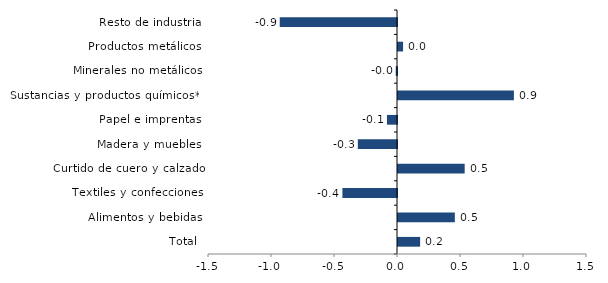
| Category | Series 0 |
|---|---|
| Total | 0.176 |
| Alimentos y bebidas | 0.451 |
| Textiles y confecciones | -0.433 |
| Curtido de cuero y calzado | 0.529 |
| Madera y muebles | -0.311 |
| Papel e imprentas | -0.08 |
| Sustancias y productos químicos** | 0.92 |
| Minerales no metálicos | -0.01 |
| Productos metálicos | 0.04 |
| Resto de industria | -0.931 |